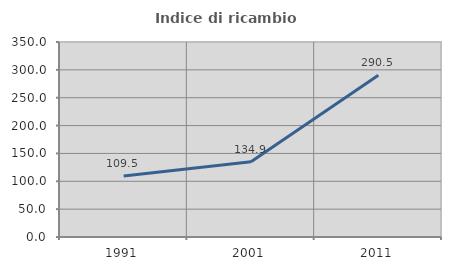
| Category | Indice di ricambio occupazionale  |
|---|---|
| 1991.0 | 109.459 |
| 2001.0 | 134.918 |
| 2011.0 | 290.45 |